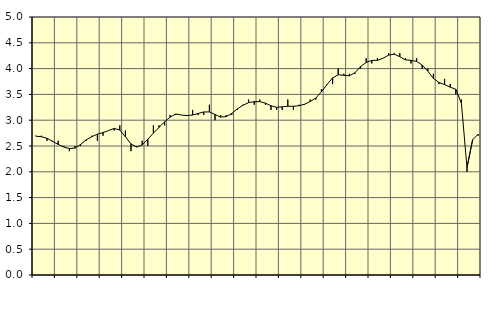
| Category | Piggar | Series 1 |
|---|---|---|
| nan | 2.7 | 2.69 |
| 1.0 | 2.7 | 2.68 |
| 1.0 | 2.6 | 2.65 |
| 1.0 | 2.6 | 2.59 |
| nan | 2.6 | 2.53 |
| 2.0 | 2.5 | 2.48 |
| 2.0 | 2.4 | 2.45 |
| 2.0 | 2.5 | 2.46 |
| nan | 2.5 | 2.53 |
| 3.0 | 2.6 | 2.62 |
| 3.0 | 2.7 | 2.68 |
| 3.0 | 2.6 | 2.73 |
| nan | 2.7 | 2.76 |
| 4.0 | 2.8 | 2.8 |
| 4.0 | 2.8 | 2.84 |
| 4.0 | 2.9 | 2.81 |
| nan | 2.8 | 2.68 |
| 5.0 | 2.4 | 2.54 |
| 5.0 | 2.5 | 2.48 |
| 5.0 | 2.6 | 2.52 |
| nan | 2.5 | 2.63 |
| 6.0 | 2.9 | 2.75 |
| 6.0 | 2.9 | 2.86 |
| 6.0 | 2.9 | 2.97 |
| nan | 3.1 | 3.06 |
| 7.0 | 3.1 | 3.12 |
| 7.0 | 3.1 | 3.1 |
| 7.0 | 3.1 | 3.09 |
| nan | 3.2 | 3.1 |
| 8.0 | 3.1 | 3.13 |
| 8.0 | 3.1 | 3.16 |
| 8.0 | 3.3 | 3.16 |
| nan | 3 | 3.11 |
| 9.0 | 3.1 | 3.06 |
| 9.0 | 3.1 | 3.07 |
| 9.0 | 3.1 | 3.13 |
| nan | 3.2 | 3.22 |
| 10.0 | 3.3 | 3.29 |
| 10.0 | 3.4 | 3.34 |
| 10.0 | 3.3 | 3.36 |
| nan | 3.4 | 3.36 |
| 11.0 | 3.3 | 3.33 |
| 11.0 | 3.2 | 3.28 |
| 11.0 | 3.2 | 3.25 |
| nan | 3.2 | 3.26 |
| 12.0 | 3.4 | 3.27 |
| 12.0 | 3.2 | 3.27 |
| 12.0 | 3.3 | 3.28 |
| nan | 3.3 | 3.31 |
| 13.0 | 3.4 | 3.36 |
| 13.0 | 3.4 | 3.43 |
| 13.0 | 3.6 | 3.55 |
| nan | 3.7 | 3.69 |
| 14.0 | 3.7 | 3.82 |
| 14.0 | 4 | 3.88 |
| 14.0 | 3.9 | 3.87 |
| nan | 3.9 | 3.86 |
| 15.0 | 3.9 | 3.92 |
| 15.0 | 4 | 4.04 |
| 15.0 | 4.2 | 4.12 |
| nan | 4.1 | 4.16 |
| 16.0 | 4.2 | 4.16 |
| 16.0 | 4.2 | 4.2 |
| 16.0 | 4.3 | 4.26 |
| nan | 4.3 | 4.28 |
| 17.0 | 4.3 | 4.23 |
| 17.0 | 4.2 | 4.17 |
| 17.0 | 4.1 | 4.16 |
| nan | 4.2 | 4.14 |
| 18.0 | 4 | 4.07 |
| 18.0 | 4 | 3.95 |
| 18.0 | 3.9 | 3.81 |
| nan | 3.7 | 3.73 |
| 19.0 | 3.8 | 3.69 |
| 19.0 | 3.7 | 3.64 |
| 19.0 | 3.5 | 3.6 |
| nan | 3.4 | 3.33 |
| 20.0 | 2 | 2.08 |
| 20.0 | 2.6 | 2.62 |
| 20.0 | 2.7 | 2.73 |